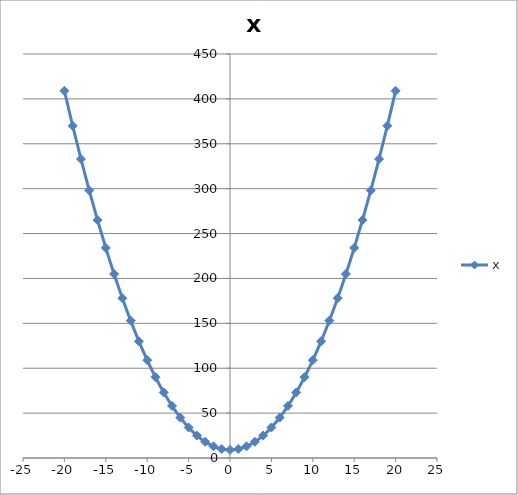
| Category | x |
|---|---|
| -20.0 | 409 |
| -19.0 | 370 |
| -18.0 | 333 |
| -17.0 | 298 |
| -16.0 | 265 |
| -15.0 | 234 |
| -14.0 | 205 |
| -13.0 | 178 |
| -12.0 | 153 |
| -11.0 | 130 |
| -10.0 | 109 |
| -9.0 | 90 |
| -8.0 | 73 |
| -7.0 | 58 |
| -6.0 | 45 |
| -5.0 | 34 |
| -4.0 | 25 |
| -3.0 | 18 |
| -2.0 | 13 |
| -1.0 | 10 |
| 0.0 | 9 |
| 1.0 | 10 |
| 2.0 | 13 |
| 3.0 | 18 |
| 4.0 | 25 |
| 5.0 | 34 |
| 6.0 | 45 |
| 7.0 | 58 |
| 8.0 | 73 |
| 9.0 | 90 |
| 10.0 | 109 |
| 11.0 | 130 |
| 12.0 | 153 |
| 13.0 | 178 |
| 14.0 | 205 |
| 15.0 | 234 |
| 16.0 | 265 |
| 17.0 | 298 |
| 18.0 | 333 |
| 19.0 | 370 |
| 20.0 | 409 |